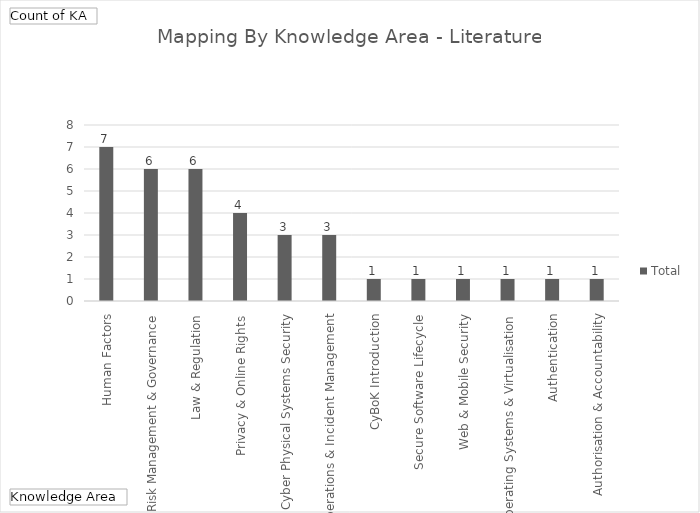
| Category | Total |
|---|---|
| Human Factors | 7 |
| Risk Management & Governance | 6 |
| Law & Regulation | 6 |
| Privacy & Online Rights | 4 |
| Cyber Physical Systems Security | 3 |
| Security Operations & Incident Management | 3 |
| CyBoK Introduction | 1 |
| Secure Software Lifecycle | 1 |
| Web & Mobile Security | 1 |
| Operating Systems & Virtualisation | 1 |
| Authentication, Authorisation & Accountability | 1 |
| Malware & Attack Technology | 1 |